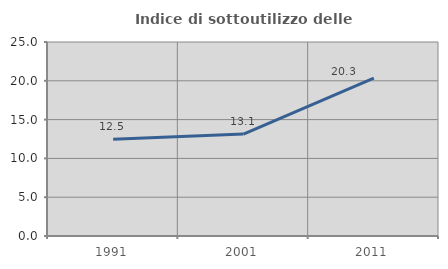
| Category | Indice di sottoutilizzo delle abitazioni  |
|---|---|
| 1991.0 | 12.475 |
| 2001.0 | 13.14 |
| 2011.0 | 20.347 |